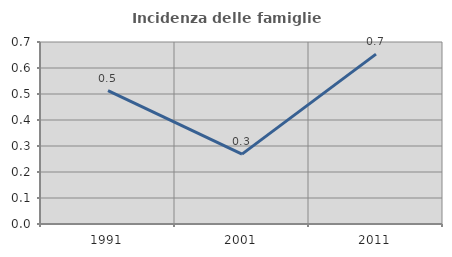
| Category | Incidenza delle famiglie numerose |
|---|---|
| 1991.0 | 0.513 |
| 2001.0 | 0.269 |
| 2011.0 | 0.653 |